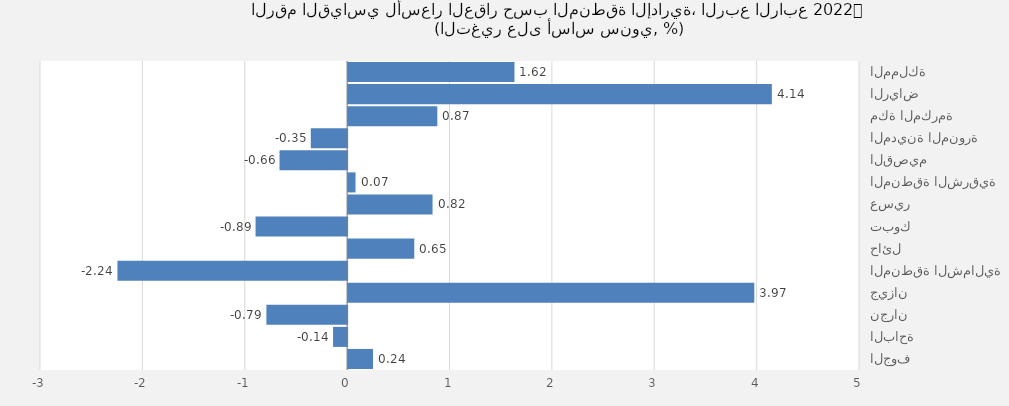
| Category | 2022 |
|---|---|
| المملكة | 1.625 |
| الرياض | 4.139 |
| مكة المكرمة | 0.871 |
| المدينة المنورة | -0.355 |
| القصيم | -0.66 |
| المنطقة الشرقية | 0.072 |
| عسير | 0.825 |
| تبوك | -0.895 |
| حائل | 0.646 |
| المنطقة الشمالية | -2.244 |
| جيزان | 3.968 |
| نجران | -0.789 |
| الباحة | -0.137 |
| الجوف | 0.243 |